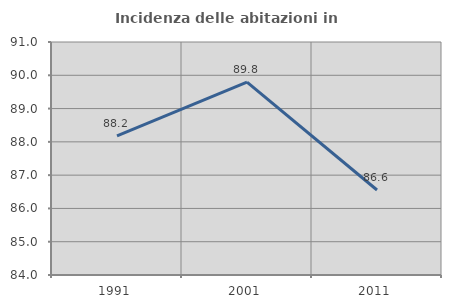
| Category | Incidenza delle abitazioni in proprietà  |
|---|---|
| 1991.0 | 88.182 |
| 2001.0 | 89.794 |
| 2011.0 | 86.553 |